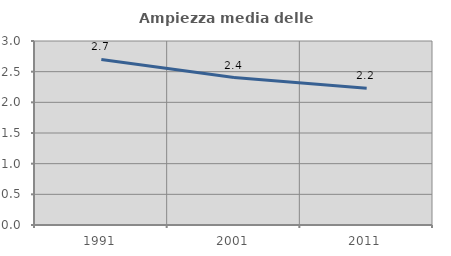
| Category | Ampiezza media delle famiglie |
|---|---|
| 1991.0 | 2.7 |
| 2001.0 | 2.403 |
| 2011.0 | 2.228 |